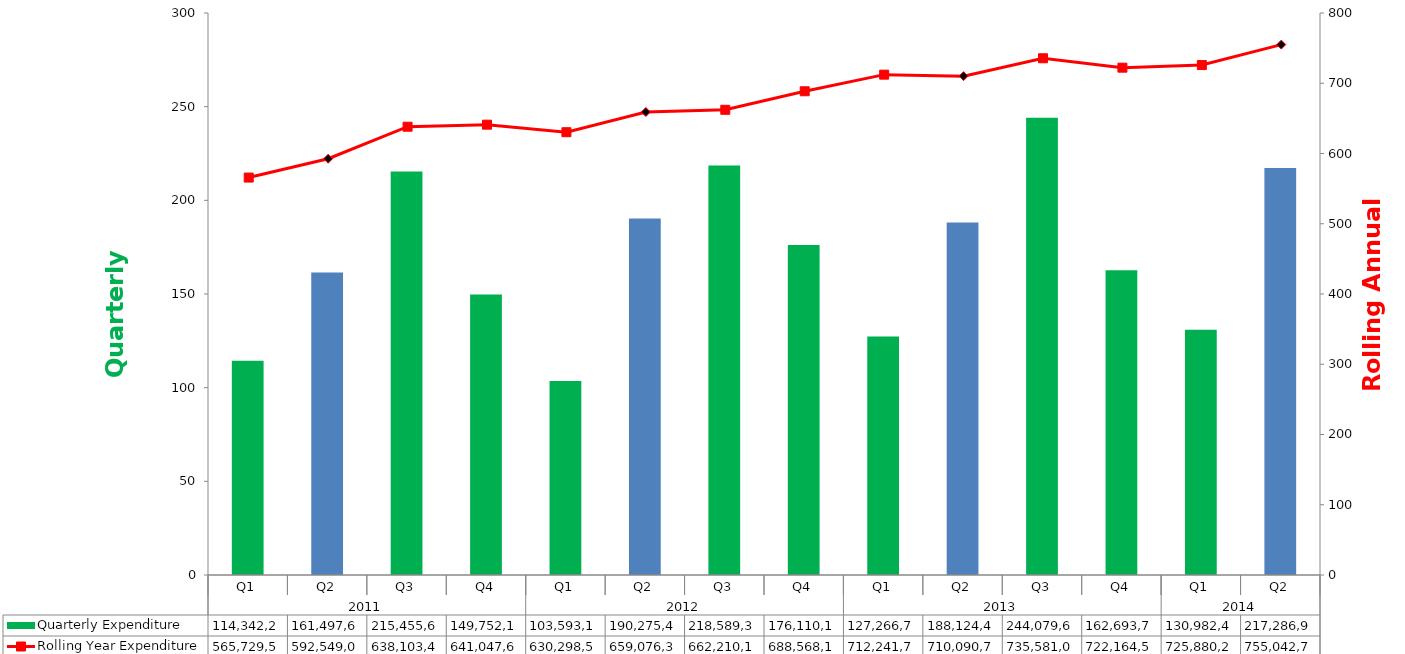
| Category | Quarterly Expenditure  |
|---|---|
| 0 | 114342274 |
| 1 | 161497605 |
| 2 | 215455610 |
| 3 | 149752192 |
| 4 | 103593156 |
| 5 | 190275436 |
| 6 | 218589347 |
| 7 | 176110195 |
| 8 | 127266775 |
| 9 | 188124471 |
| 10 | 244079603 |
| 11 | 162693715 |
| 12 | 130982453 |
| 13 | 217286956 |